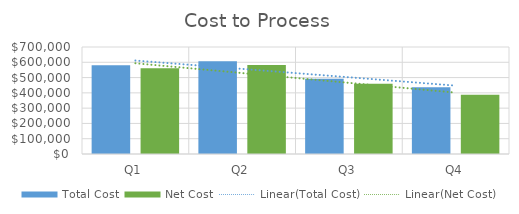
| Category | Total Cost | Net Cost |
|---|---|---|
| Q1 | 581200 | 560700 |
| Q2 | 607100 | 582100 |
| Q3 | 492200 | 459200 |
| Q4 | 437000 | 388000 |